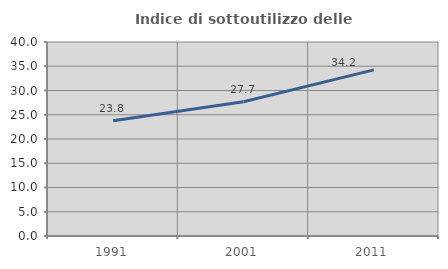
| Category | Indice di sottoutilizzo delle abitazioni  |
|---|---|
| 1991.0 | 23.756 |
| 2001.0 | 27.683 |
| 2011.0 | 34.249 |